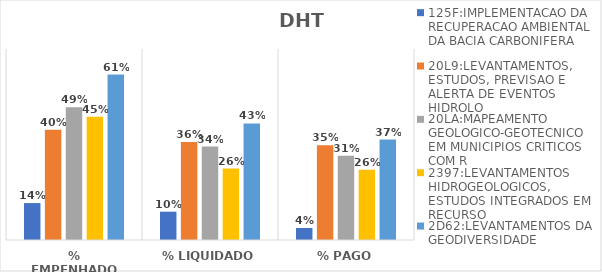
| Category | 125F:IMPLEMENTACAO DA RECUPERACAO AMBIENTAL DA BACIA CARBONIFERA | 20L9:LEVANTAMENTOS, ESTUDOS, PREVISAO E ALERTA DE EVENTOS HIDROLO | 20LA:MAPEAMENTO GEOLOGICO-GEOTECNICO EM MUNICIPIOS CRITICOS COM R | 2397:LEVANTAMENTOS HIDROGEOLOGICOS, ESTUDOS INTEGRADOS EM RECURSO | 2D62:LEVANTAMENTOS DA GEODIVERSIDADE |
|---|---|---|---|---|---|
| % EMPENHADO | 0.135 | 0.404 | 0.487 | 0.451 | 0.606 |
| % LIQUIDADO | 0.104 | 0.359 | 0.343 | 0.262 | 0.427 |
| % PAGO | 0.044 | 0.348 | 0.309 | 0.258 | 0.368 |